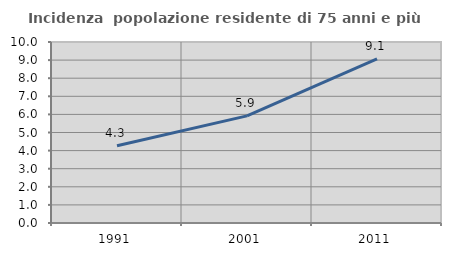
| Category | Incidenza  popolazione residente di 75 anni e più |
|---|---|
| 1991.0 | 4.269 |
| 2001.0 | 5.917 |
| 2011.0 | 9.062 |